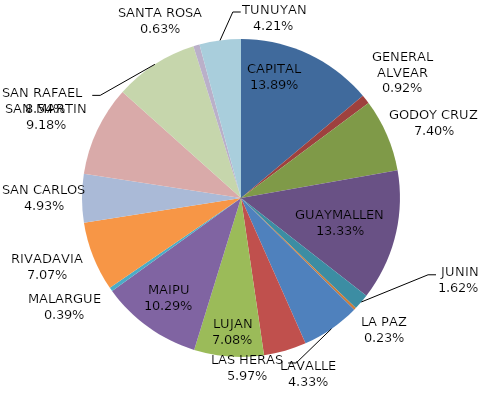
| Category | Total Otros Juegos Propios Recaudación  |
|---|---|
| CAPITAL | 604205 |
| GENERAL ALVEAR | 39905 |
| GODOY CRUZ | 321605 |
| GUAYMALLEN | 579580 |
| JUNIN | 70550 |
| LA PAZ | 9870 |
| LAS HERAS | 259390 |
| LAVALLE | 188390 |
| LUJAN | 307715 |
| MAIPU | 447325 |
| MALARGUE | 17135 |
| RIVADAVIA | 307400 |
| SAN CARLOS | 214350 |
| SAN MARTIN | 399020 |
| SAN RAFAEL  | 371515 |
| SANTA ROSA | 27485 |
| TUNUYAN | 182870 |